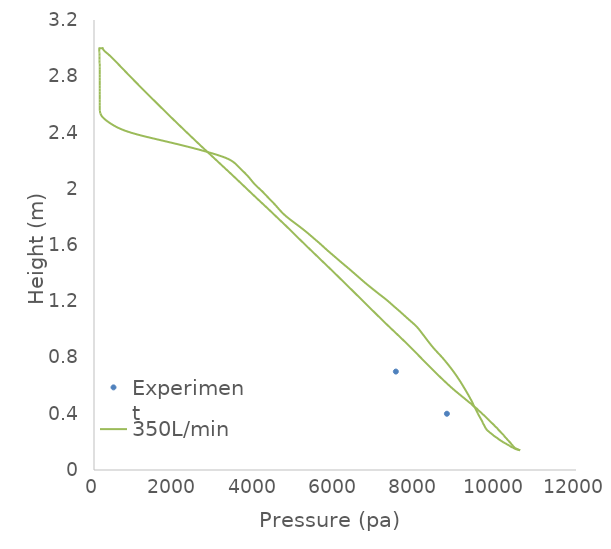
| Category | Experiment |
|---|---|
| 8786.0 | 0.4 |
| 7515.000000000001 | 0.7 |